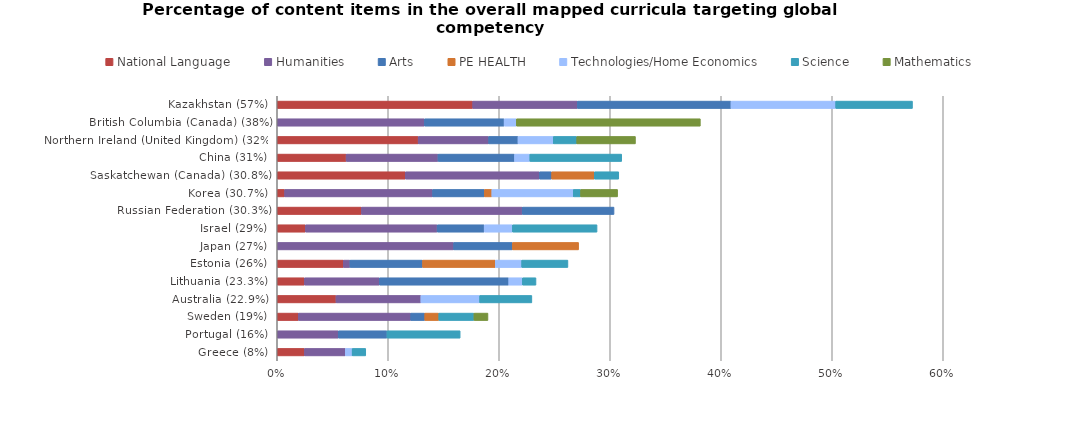
| Category | National Language | Humanities | Arts | PE HEALTH | Technologies/Home Economics | Science | Mathematics |
|---|---|---|---|---|---|---|---|
| Greece (8%) | 0.025 | 0.037 | 0 | 0 | 0.006 | 0.012 | 0 |
| Portugal (16%) | 0 | 0.055 | 0.044 | 0 | 0 | 0.066 | 0 |
| Sweden (19%) | 0.019 | 0.101 | 0.013 | 0.013 | 0 | 0.032 | 0.013 |
| Australia (22.9%) | 0.053 | 0.076 | 0 | 0 | 0.053 | 0.047 | 0 |
| Lithuania (23.3%) | 0.025 | 0.067 | 0.117 | 0 | 0.012 | 0.012 | 0 |
| Estonia (26%) | 0.06 | 0.006 | 0.065 | 0.065 | 0.024 | 0.042 | 0 |
| Japan (27%) | 0 | 0.159 | 0.053 | 0.06 | 0 | 0 | 0 |
| Israel (29%) | 0.025 | 0.119 | 0.042 | 0 | 0.025 | 0.076 | 0 |
| Russian Federation (30.3%) | 0.076 | 0.145 | 0.083 | 0 | 0 | 0 | 0 |
| Korea (30.7%) | 0.007 | 0.133 | 0.047 | 0.007 | 0.073 | 0.007 | 0.033 |
| Saskatchewan (Canada) (30.8%) | 0.115 | 0.121 | 0.011 | 0.038 | 0 | 0.022 | 0 |
| China (31%) | 0.062 | 0.083 | 0.069 | 0 | 0.014 | 0.083 | 0 |
| Northern Ireland (United Kingdom) (32%) | 0.127 | 0.063 | 0.026 | 0 | 0.032 | 0.021 | 0.053 |
| British Columbia (Canada) (38%) | 0 | 0.133 | 0.072 | 0 | 0.011 | 0 | 0.166 |
| Kazakhstan (57%) | 0.176 | 0.094 | 0.138 | 0 | 0.094 | 0.069 | 0 |